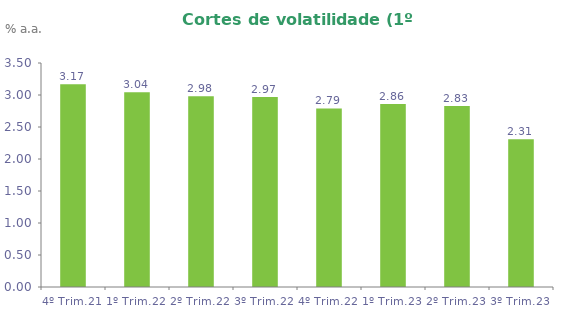
| Category | Series 0 |
|---|---|
| 4º Trim.21 | 3.166 |
| 1º Trim.22 | 3.042 |
| 2º Trim.22 | 2.981 |
| 3º Trim.22 | 2.97 |
| 4º Trim.22 | 2.79 |
| 1º Trim.23 | 2.86 |
| 2º Trim.23 | 2.83 |
| 3º Trim.23 | 2.31 |